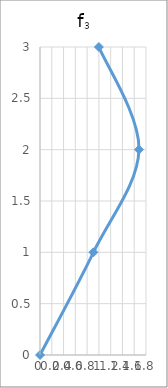
| Category | f3 |
|---|---|
| 0.0 | 0 |
| 0.907096106941103 | 1 |
| 1.6806659804795903 | 2 |
| 1.0 | 3 |